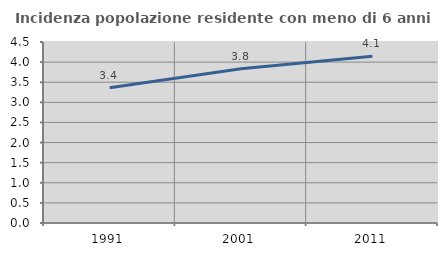
| Category | Incidenza popolazione residente con meno di 6 anni |
|---|---|
| 1991.0 | 3.362 |
| 2001.0 | 3.833 |
| 2011.0 | 4.143 |